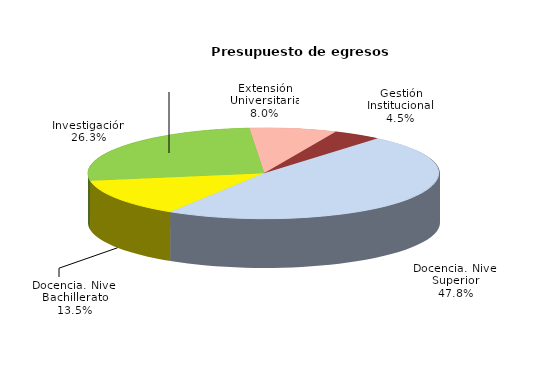
| Category | Series 0 |
|---|---|
| Docencia. Nivel Superior | 22289611888 |
| Docencia. Nivel Bachillerato | 6283221625 |
| Investigación | 12242498656 |
| Extensión Universitaria | 3728810454 |
| Gestión Institucional | 2085601804 |